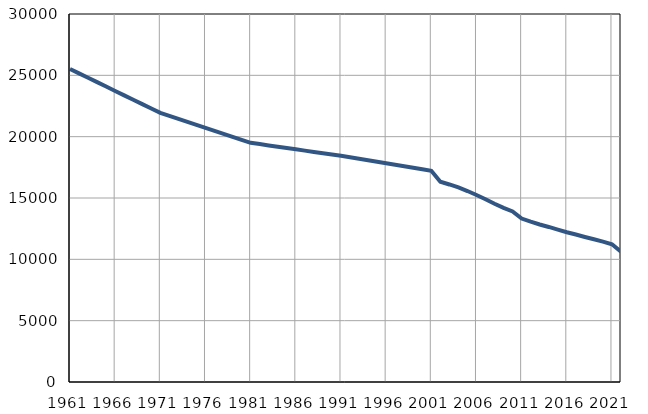
| Category | Population
size |
|---|---|
| 1961.0 | 25519 |
| 1962.0 | 25161 |
| 1963.0 | 24803 |
| 1964.0 | 24445 |
| 1965.0 | 24087 |
| 1966.0 | 23729 |
| 1967.0 | 23370 |
| 1968.0 | 23012 |
| 1969.0 | 22654 |
| 1970.0 | 22296 |
| 1971.0 | 21938 |
| 1972.0 | 21694 |
| 1973.0 | 21450 |
| 1974.0 | 21206 |
| 1975.0 | 20963 |
| 1976.0 | 20720 |
| 1977.0 | 20476 |
| 1978.0 | 20232 |
| 1979.0 | 19988 |
| 1980.0 | 19745 |
| 1981.0 | 19501 |
| 1982.0 | 19394 |
| 1983.0 | 19288 |
| 1984.0 | 19182 |
| 1985.0 | 19076 |
| 1986.0 | 18970 |
| 1987.0 | 18863 |
| 1988.0 | 18757 |
| 1989.0 | 18651 |
| 1990.0 | 18544 |
| 1991.0 | 18438 |
| 1992.0 | 18316 |
| 1993.0 | 18193 |
| 1994.0 | 18071 |
| 1995.0 | 17949 |
| 1996.0 | 17826 |
| 1997.0 | 17704 |
| 1998.0 | 17581 |
| 1999.0 | 17459 |
| 2000.0 | 17337 |
| 2001.0 | 17214 |
| 2002.0 | 16322 |
| 2003.0 | 16104 |
| 2004.0 | 15862 |
| 2005.0 | 15568 |
| 2006.0 | 15245 |
| 2007.0 | 14899 |
| 2008.0 | 14530 |
| 2009.0 | 14191 |
| 2010.0 | 13905 |
| 2011.0 | 13325 |
| 2012.0 | 13067 |
| 2013.0 | 12843 |
| 2014.0 | 12640 |
| 2015.0 | 12419 |
| 2016.0 | 12210 |
| 2017.0 | 12021 |
| 2018.0 | 11825 |
| 2019.0 | 11642 |
| 2020.0 | 11444 |
| 2021.0 | 11226 |
| 2022.0 | 10615 |